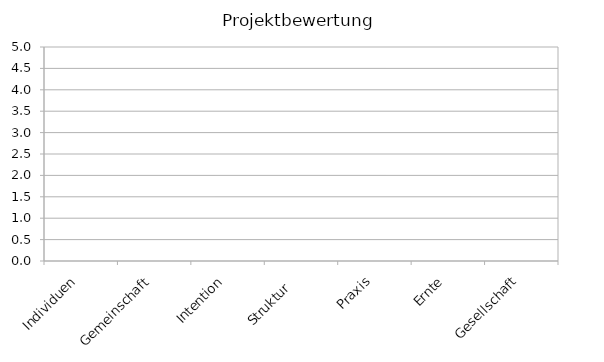
| Category | Series 0 |
|---|---|
| Individuen | 0 |
| Gemeinschaft | 0 |
| Intention | 0 |
| Struktur   | 0 |
| Praxis | 0 |
| Ernte | 0 |
| Gesellschaft | 0 |